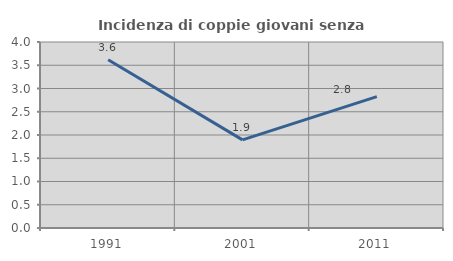
| Category | Incidenza di coppie giovani senza figli |
|---|---|
| 1991.0 | 3.62 |
| 2001.0 | 1.896 |
| 2011.0 | 2.825 |